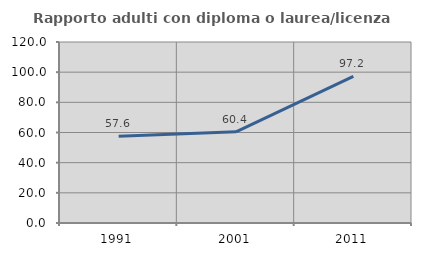
| Category | Rapporto adulti con diploma o laurea/licenza media  |
|---|---|
| 1991.0 | 57.576 |
| 2001.0 | 60.448 |
| 2011.0 | 97.163 |